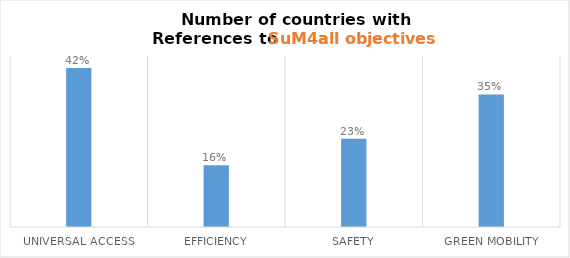
| Category | Series 0 |
|---|---|
| Universal Access | 0.419 |
| Efficiency | 0.163 |
| Safety | 0.233 |
| Green Mobility | 0.349 |